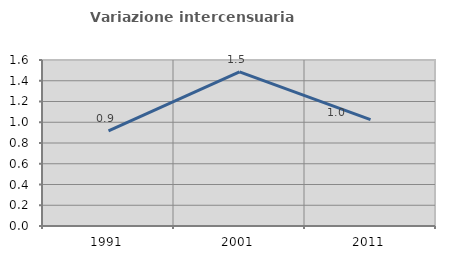
| Category | Variazione intercensuaria annua |
|---|---|
| 1991.0 | 0.917 |
| 2001.0 | 1.485 |
| 2011.0 | 1.026 |